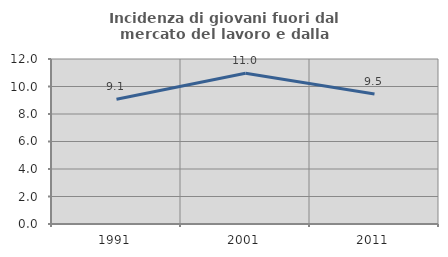
| Category | Incidenza di giovani fuori dal mercato del lavoro e dalla formazione  |
|---|---|
| 1991.0 | 9.076 |
| 2001.0 | 10.959 |
| 2011.0 | 9.454 |